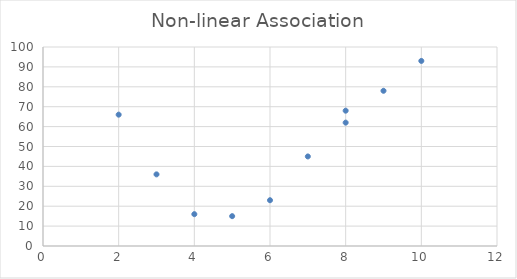
| Category | Series 0 |
|---|---|
| 2.0 | 66 |
| 4.0 | 16 |
| 7.0 | 45 |
| 5.0 | 15 |
| 8.0 | 68 |
| 6.0 | 23 |
| 9.0 | 78 |
| 8.0 | 62 |
| 3.0 | 36 |
| 10.0 | 93 |